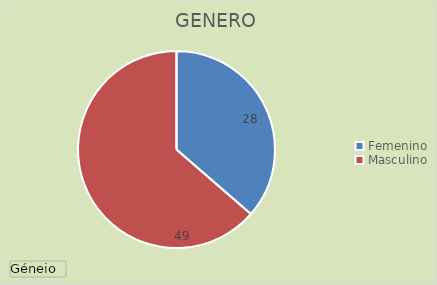
| Category | Total |
|---|---|
| Femenino | 28 |
| Masculino | 49 |